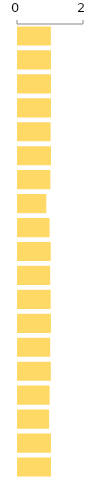
| Category | Score |
|---|---|
| 0 | 0.996 |
| 1 | 1 |
| 2 | 1 |
| 3 | 1 |
| 4 | 0.988 |
| 5 | 1 |
| 6 | 0.982 |
| 7 | 0.857 |
| 8 | 0.957 |
| 9 | 0.992 |
| 10 | 0.976 |
| 11 | 0.991 |
| 12 | 0.998 |
| 13 | 0.976 |
| 14 | 0.994 |
| 15 | 0.959 |
| 16 | 0.943 |
| 17 | 0.999 |
| 18 | 1 |